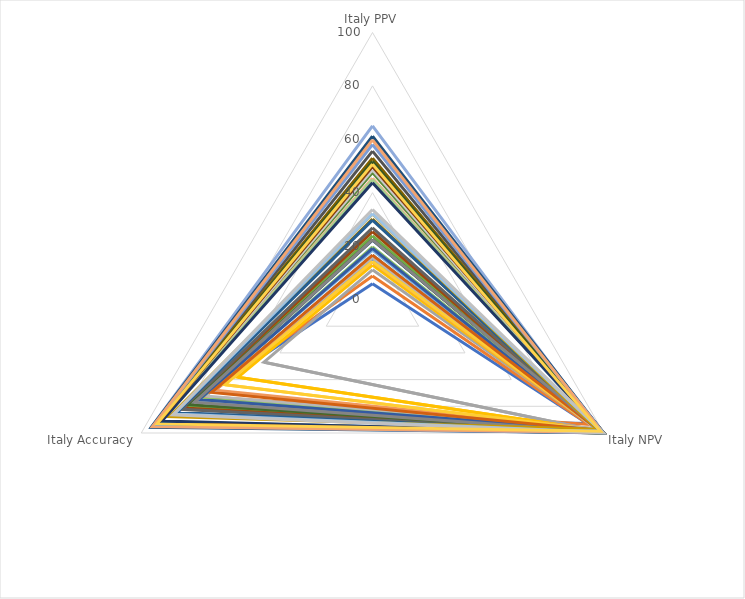
| Category | Series 0 | Series 1 | Series 2 | Series 3 | Series 4 | Series 5 | Series 6 | Series 7 | Series 8 | Series 9 | Series 10 | Series 11 | Series 12 | Series 13 | Series 14 | Series 15 | Series 16 | Series 17 | Series 18 | Series 19 | Series 20 | Series 21 | Series 22 | Series 23 | Series 24 | Series 25 | Series 26 | Series 27 | Series 28 | Series 29 | Series 30 | Series 31 | Series 32 | Series 33 | Series 34 | Series 35 | Series 36 | Series 37 | Series 38 | Series 39 |
|---|---|---|---|---|---|---|---|---|---|---|---|---|---|---|---|---|---|---|---|---|---|---|---|---|---|---|---|---|---|---|---|---|---|---|---|---|---|---|---|---|
| Italy PPV | 5.92 | 8.81 | 11.13 | 12.91 | 16.59 | 23.8 | 22.27 | 25.44 | 26.81 | 30.13 | 29.71 | 22.49 | 15.25 | 14.03 | 15.67 | 14.24 | 18.52 | 19.69 | 19.13 | 16.6 | 22.44 | 32.03 | 45.15 | 47.53 | 65.02 | 45.45 | 48.56 | 51.82 | 32.17 | 44.88 | 43.73 | 49.8 | 55.57 | 52.93 | 61.13 | 51.72 | 58.06 | 59.81 | 33.68 | 50.7 |
| Italy NPV | 92.92 | 93.61 | 99.05 | 98.25 | 98.65 | 98.85 | 99.45 | 98.78 | 98.99 | 97.84 | 98.92 | 98.43 | 97.49 | 96.78 | 96.78 | 98.03 | 97.15 | 98.76 | 98.03 | 98.21 | 99.34 | 97.28 | 98.66 | 99.2 | 98.47 | 99.37 | 99.46 | 99.73 | 99.51 | 99.73 | 99.82 | 99.73 | 100 | 100 | 99.83 | 99.91 | 99.91 | 99.39 | 99.81 | 98.6 |
| Italy Accuracy | 86.08 | 72.69 | 46.94 | 58.23 | 68.32 | 79.52 | 76.58 | 81.32 | 82.27 | 86.15 | 84.64 | 78.78 | 68.6 | 67.93 | 72.27 | 63.78 | 76.39 | 74.13 | 74.98 | 69.59 | 77 | 87.79 | 91.76 | 92.36 | 95.6 | 91.72 | 92.63 | 93.49 | 85.7 | 91.74 | 91.06 | 92.96 | 94.42 | 93.79 | 95.68 | 93.48 | 94.93 | 95.13 | 86.4 | 93.17 |